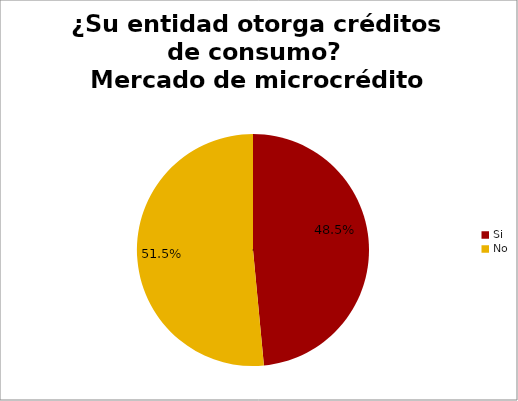
| Category | ¿Su entidad otorga créditos de consumo? Mercado de microcrédito |
|---|---|
| Si | 0.485 |
| No | 0.515 |